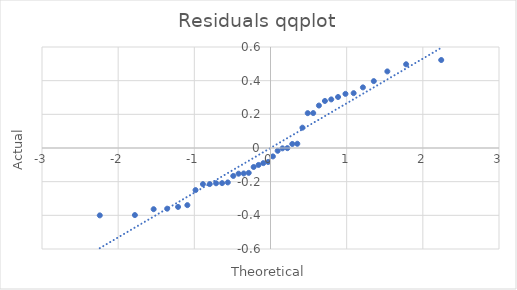
| Category | Sorted_Residuals |
|---|---|
| -2.2414027276049446 | -0.4 |
| -1.7804643416920256 | -0.398 |
| -1.5341205443525459 | -0.363 |
| -1.3563117453352478 | -0.36 |
| -1.2133396224885178 | -0.35 |
| -1.091620367434168 | -0.339 |
| -0.9842349604463254 | -0.25 |
| -0.8871465590188761 | -0.215 |
| -0.7977768461252382 | -0.214 |
| -0.7143674402801874 | -0.21 |
| -0.6356570136975828 | -0.209 |
| -0.5607030318750833 | -0.205 |
| -0.4887764111146694 | -0.166 |
| -0.41929575304139605 | -0.153 |
| -0.35178434493515626 | -0.151 |
| -0.28584087488116566 | -0.148 |
| -0.22111871299757052 | -0.113 |
| -0.1573106846101707 | -0.101 |
| -0.09413741432353637 | -0.09 |
| -0.031337982021426625 | -0.083 |
| 0.03133798202142648 | -0.05 |
| 0.09413741432353637 | -0.017 |
| 0.1573106846101707 | -0.002 |
| 0.22111871299757052 | -0.001 |
| 0.2858408748811657 | 0.024 |
| 0.35178434493515615 | 0.025 |
| 0.41929575304139605 | 0.121 |
| 0.4887764111146694 | 0.207 |
| 0.5607030318750833 | 0.207 |
| 0.6356570136975827 | 0.252 |
| 0.7143674402801878 | 0.279 |
| 0.7977768461252382 | 0.289 |
| 0.8871465590188761 | 0.303 |
| 0.9842349604463254 | 0.322 |
| 1.0916203674341685 | 0.326 |
| 1.213339622488518 | 0.36 |
| 1.3563117453352478 | 0.397 |
| 1.5341205443525465 | 0.455 |
| 1.7804643416920258 | 0.497 |
| 2.2414027276049464 | 0.523 |